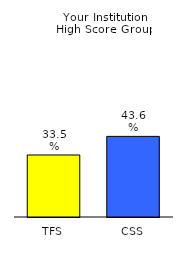
| Category | Series 0 |
|---|---|
| TFS | 0.335 |
| CSS | 0.436 |